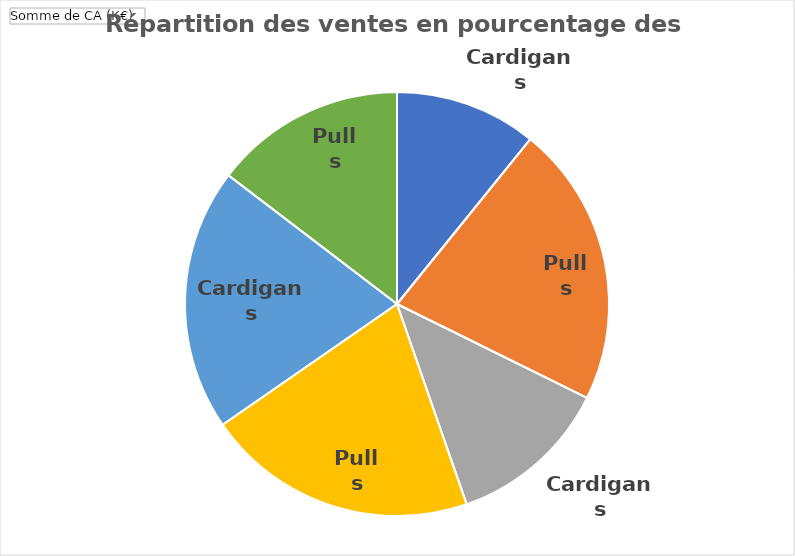
| Category | Total |
|---|---|
| 0 | 259 |
| 1 | 514 |
| 2 | 296 |
| 3 | 495 |
| 4 | 479 |
| 5 | 350 |